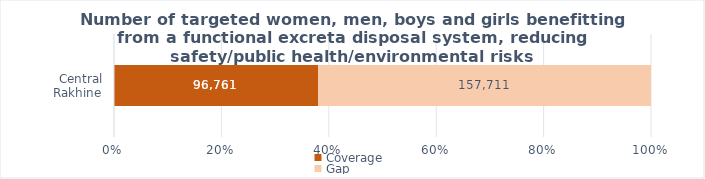
| Category | Coverage | Gap |
|---|---|---|
|  Central Rakhine  | 96761 | 157711 |